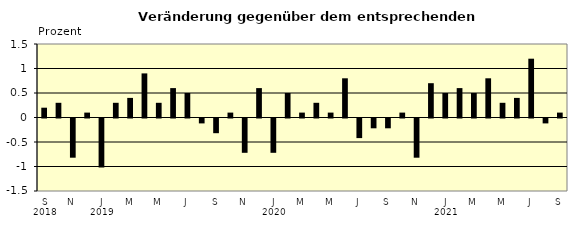
| Category | Series 0 |
|---|---|
| 0 | 0.2 |
| 1 | 0.3 |
| 2 | -0.8 |
| 3 | 0.1 |
| 4 | -1 |
| 5 | 0.3 |
| 6 | 0.4 |
| 7 | 0.9 |
| 8 | 0.3 |
| 9 | 0.6 |
| 10 | 0.5 |
| 11 | -0.1 |
| 12 | -0.3 |
| 13 | 0.1 |
| 14 | -0.7 |
| 15 | 0.6 |
| 16 | -0.7 |
| 17 | 0.5 |
| 18 | 0.1 |
| 19 | 0.3 |
| 20 | 0.1 |
| 21 | 0.8 |
| 22 | -0.4 |
| 23 | -0.2 |
| 24 | -0.2 |
| 25 | 0.1 |
| 26 | -0.8 |
| 27 | 0.7 |
| 28 | 0.5 |
| 29 | 0.6 |
| 30 | 0.5 |
| 31 | 0.8 |
| 32 | 0.3 |
| 33 | 0.4 |
| 34 | 1.2 |
| 35 | -0.1 |
| 36 | 0.1 |